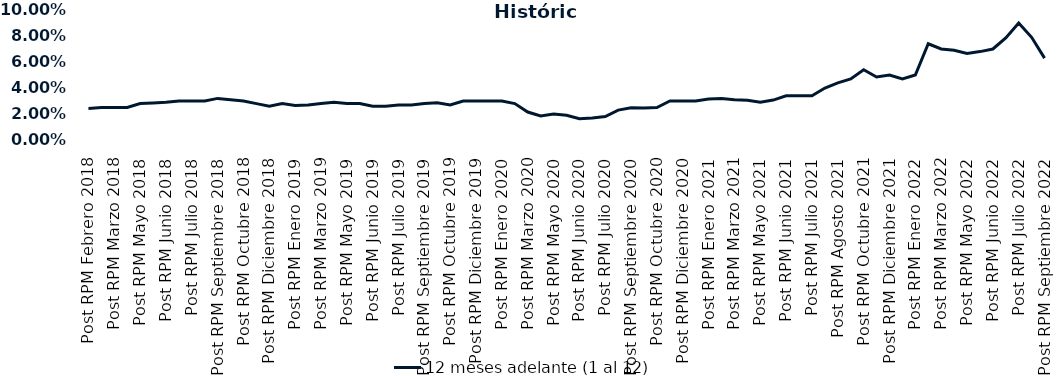
| Category | 12 meses adelante (1 al 12)  |
|---|---|
| Post RPM Febrero 2018 | 0.024 |
| Pre RPM Marzo 2018 | 0.025 |
| Post RPM Marzo 2018 | 0.025 |
| Pre RPM Mayo 2018 | 0.025 |
| Post RPM Mayo 2018 | 0.028 |
| Pre RPM Junio 2018 | 0.028 |
| Post RPM Junio 2018 | 0.029 |
| Pre RPM Julio 2018 | 0.03 |
| Post RPM Julio 2018 | 0.03 |
| Pre RPM Septiembre 2018 | 0.03 |
| Post RPM Septiembre 2018 | 0.032 |
| Pre RPM Octubre 2018 | 0.031 |
| Post RPM Octubre 2018 | 0.03 |
| Pre RPM Diciembre 2018 | 0.028 |
| Post RPM Diciembre 2018 | 0.026 |
| Pre RPM Enero 2019 | 0.028 |
| Post RPM Enero 2019 | 0.026 |
| Pre RPM Marzo 2019 | 0.027 |
| Post RPM Marzo 2019 | 0.028 |
| Pre RPM Mayo 2019 | 0.029 |
| Post RPM Mayo 2019 | 0.028 |
| Pre RPM Junio 2019 | 0.028 |
| Post RPM Junio 2019 | 0.026 |
| Pre RPM Julio 2019 | 0.026 |
| Post RPM Julio 2019 | 0.027 |
| Pre RPM Septiembre 2019 | 0.027 |
| Post RPM Septiembre 2019 | 0.028 |
| Pre RPM Octubre 2019 | 0.029 |
| Post RPM Octubre 2019 | 0.027 |
| Pre RPM Diciembre 2019 | 0.03 |
| Post RPM Diciembre 2019 | 0.03 |
| Pre RPM Enero 2020 | 0.03 |
| Post RPM Enero 2020 | 0.03 |
| Pre RPM Marzo 2020 | 0.028 |
| Post RPM Marzo 2020 | 0.022 |
| Pre RPM Mayo 2020 | 0.018 |
| Post RPM Mayo 2020 | 0.02 |
| Pre RPM Junio 2020 | 0.019 |
| Post RPM Junio 2020 | 0.016 |
| Pre RPM Julio 2020 | 0.017 |
| Post RPM Julio 2020 | 0.018 |
| Pre RPM Septiembre 2020 | 0.023 |
| Post RPM Septiembre 2020 | 0.025 |
| Pre RPM Octubre 2020 | 0.025 |
| Post RPM Octubre 2020 | 0.025 |
| Pre RPM Diciembre 2020 | 0.03 |
| Post RPM Diciembre 2020 | 0.03 |
| Pre RPM Enero 2021 | 0.03 |
| Post RPM Enero 2021 | 0.032 |
| Pre RPM Marzo 2021 | 0.032 |
| Post RPM Marzo 2021 | 0.031 |
| Pre RPM Mayo 2021 | 0.03 |
| Post RPM Mayo 2021 | 0.029 |
| Pre RPM Junio 2021 | 0.031 |
| Post RPM Junio 2021 | 0.034 |
| Pre RPM Julio 2021 | 0.034 |
| Post RPM Julio 2021 | 0.034 |
| Pre RPM Agosto 2021 | 0.04 |
| Post RPM Agosto 2021 | 0.044 |
| Pre RPM Octubre 2021 | 0.047 |
| Post RPM Octubre 2021 | 0.054 |
| Pre RPM Diciembre 2021 | 0.048 |
| Post RPM Diciembre 2021 | 0.05 |
| Pre RPM Enero 2022 | 0.047 |
| Post RPM Enero 2022 | 0.05 |
| Pre RPM Marzo 2022 | 0.074 |
| Post RPM Marzo 2022 | 0.07 |
| Pre RPM Mayo 2022 | 0.069 |
| Post RPM Mayo 2022 | 0.066 |
| Pre RPM Junio 2022 | 0.068 |
| Post RPM Junio 2022 | 0.07 |
| Pre RPM Julio 2022 | 0.078 |
| Post RPM Julio 2022 | 0.09 |
| Pre RPM Septiembre 2022 | 0.079 |
| Post RPM Septiembre 2022 | 0.063 |